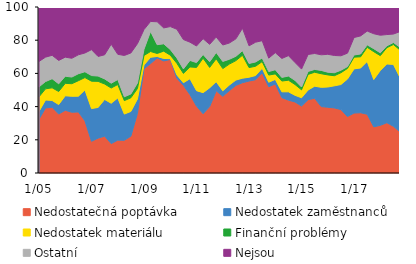
| Category | Nedostatečná poptávka | Nedostatek zaměstnanců | Nedostatek materiálu | Finanční problémy | Ostatní | Nejsou |
|---|---|---|---|---|---|---|
|  1/05 | 32.4 | 4.7 | 8.8 | 6 | 15.3 | 32.8 |
| 4 | 39.2 | 4.8 | 6.7 | 4.4 | 14.7 | 30.2 |
| 7 | 39.6 | 4.1 | 7.6 | 5.5 | 14.1 | 29.1 |
| 10 | 35.5 | 5.7 | 7.9 | 4.6 | 14.1 | 32.2 |
|  1/06 | 37.8 | 8.7 | 7.5 | 4.3 | 11.5 | 30.2 |
| 4 | 36.6 | 9.6 | 7.6 | 4 | 11.3 | 30.9 |
| 7 | 36.8 | 9.5 | 9.3 | 4.2 | 11.4 | 28.8 |
| 10 | 31.4 | 18.6 | 7.5 | 3.5 | 11.3 | 27.7 |
|  1/07 | 19.1 | 19.7 | 16.5 | 3.4 | 15.6 | 25.7 |
| 4 | 21 | 18.5 | 15.7 | 3.2 | 11.8 | 29.8 |
| 7 | 22.2 | 22.1 | 9.3 | 3.1 | 14.5 | 28.8 |
| 10 | 17.7 | 24.3 | 9.2 | 2.9 | 23.5 | 22.4 |
|  1/08 | 19.8 | 25.4 | 8.1 | 3 | 15.2 | 28.5 |
| 4 | 19.7 | 15.8 | 8.1 | 2.3 | 24.9 | 29.2 |
| 7 | 22.2 | 14.9 | 8.2 | 2.3 | 24.7 | 27.7 |
| 10 | 35.9 | 8.7 | 6.3 | 3.3 | 23.7 | 22.1 |
|  1/09 | 62.8 | 2.3 | 5.7 | 3.8 | 11.8 | 13.6 |
| 4 | 65.9 | 3.8 | 3.5 | 12.1 | 6 | 8.7 |
| 7 | 69.3 | 0.9 | 1.8 | 5.3 | 13.8 | 8.9 |
| 10 | 67.5 | 1.5 | 4.4 | 4.4 | 9.6 | 12.6 |
|  1/10 | 68.4 | 0.5 | 2.1 | 3.4 | 13.8 | 11.8 |
| 4 | 57.1 | 2 | 7 | 3.2 | 17.3 | 13.4 |
| 7 | 52.8 | 1.6 | 5.6 | 2.7 | 17.7 | 19.6 |
| 10 | 47.2 | 9.6 | 7.1 | 3.9 | 11 | 21.2 |
|  1/11 | 40.3 | 9.3 | 14 | 2.9 | 10 | 23.5 |
| 4 | 35.7 | 12.7 | 20.8 | 2.2 | 9.5 | 19.1 |
| 7 | 40 | 11.3 | 12.3 | 3.4 | 10.5 | 22.5 |
| 10 | 49.5 | 5.5 | 13.8 | 3.8 | 9.3 | 18.1 |
|  1/12 | 46.2 | 3.3 | 13.4 | 4.3 | 9.9 | 22.9 |
| 4 | 49.6 | 3.4 | 12.6 | 2.9 | 9.8 | 21.7 |
| 7 | 52.8 | 3.2 | 11.7 | 2.6 | 10.5 | 19.2 |
| 10 | 54.4 | 2.7 | 13.8 | 2.8 | 13.5 | 12.8 |
|  1/13 | 55.4 | 2.3 | 5.8 | 2.5 | 10.6 | 23.4 |
| 4 | 56.2 | 2.5 | 5.6 | 2.6 | 11.9 | 21.2 |
| 7 | 60.3 | 2.8 | 4 | 2.2 | 10.4 | 20.3 |
| 10 | 52 | 2.7 | 4.3 | 2.1 | 8.1 | 30.8 |
|  1/14 | 53.6 | 2.8 | 3.3 | 2.5 | 10.3 | 27.5 |
| 4 | 45.4 | 3.5 | 6.5 | 2.2 | 11.4 | 31 |
| 7 | 43.9 | 5 | 7 | 2.5 | 12.3 | 29.3 |
| 10 | 42.8 | 4 | 6.5 | 2.5 | 10.8 | 33.4 |
|  1/15 | 40.3 | 5 | 4.8 | 1.7 | 10.8 | 37.4 |
| 4 | 44.2 | 5.8 | 9.4 | 1.8 | 10.2 | 28.6 |
| 7 | 45 | 7.3 | 8.4 | 1.7 | 9.6 | 28 |
| 10 | 40 | 11.6 | 8.2 | 2 | 9.4 | 28.8 |
|  1/16 | 39.6 | 12.2 | 7.3 | 1.6 | 10.8 | 28.5 |
| 4 | 39.2 | 13.3 | 6.1 | 1.8 | 10.4 | 29.2 |
| 7 | 38.2 | 15.1 | 7.1 | 1.5 | 8.7 | 29.4 |
| 10 | 34 | 22.6 | 6.4 | 1.1 | 8.1 | 27.8 |
|  1/17 | 36.1 | 26.6 | 7.1 | 1.3 | 10.5 | 18.4 |
| 4 | 36.3 | 27 | 6.7 | 1.7 | 10.9 | 17.4 |
| 7 | 35.4 | 31.8 | 8.5 | 1.5 | 8.3 | 14.5 |
| 10 | 27.8 | 28.5 | 16.8 | 1.8 | 9 | 16.1 |
|  1/18 | 28.7 | 33 | 9 | 1.7 | 10.6 | 17 |
| 4 | 30.3 | 35.4 | 9.8 | 1.1 | 6.8 | 16.3 |
| 7 | 28.1 | 37.3 | 12 | 1.2 | 5.1 | 16.3 |
| 10 | 24.8 | 32.7 | 16.6 | 1.6 | 9.5 | 14.8 |